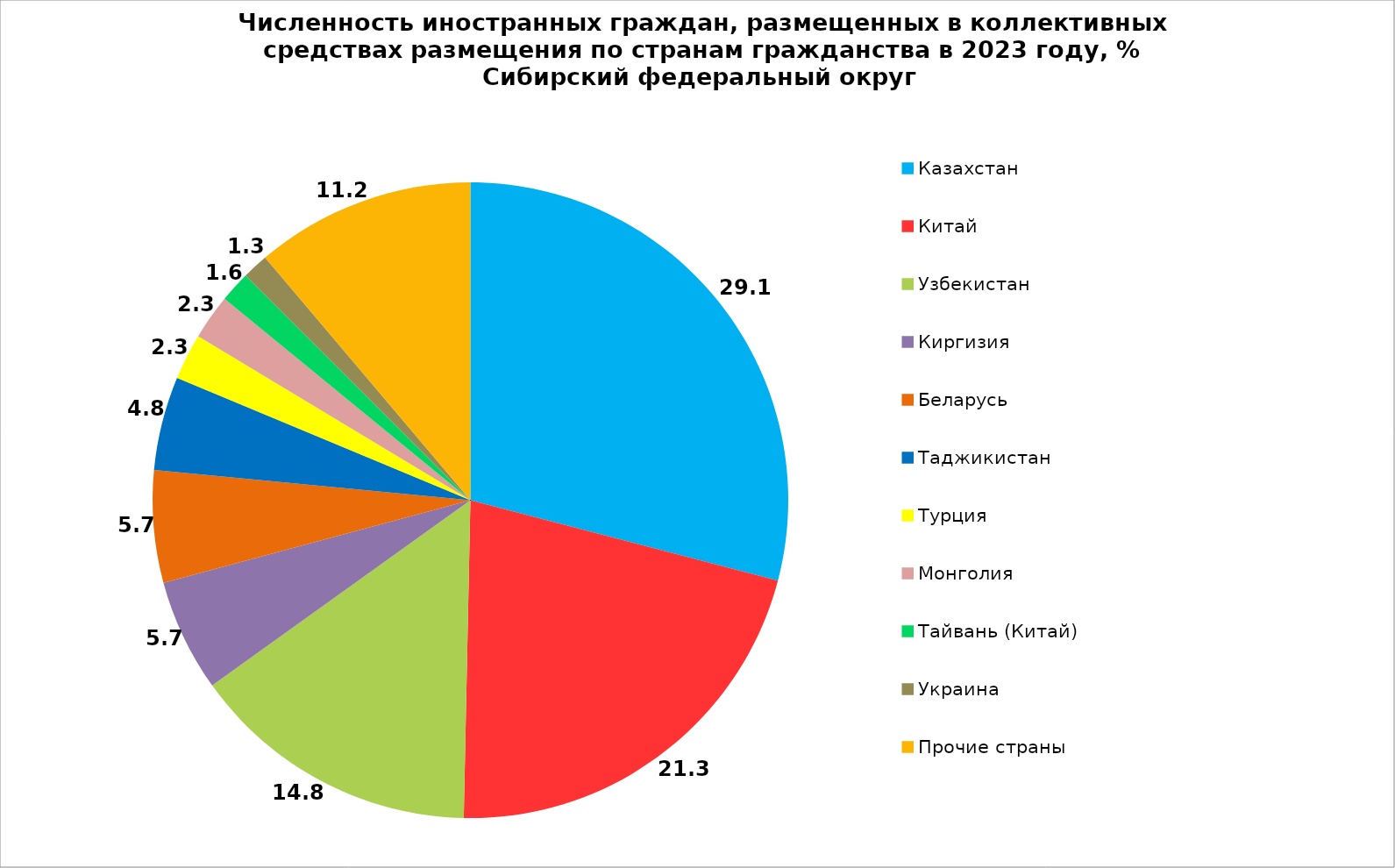
| Category | Series 0 |
|---|---|
| Казахстан | 29.075 |
| Китай | 21.259 |
| Узбекистан | 14.759 |
| Киргизия | 5.726 |
| Беларусь | 5.7 |
| Таджикистан | 4.767 |
| Турция | 2.346 |
| Монголия | 2.289 |
| Тайвань (Китай) | 1.576 |
| Украина | 1.325 |
| Прочие страны | 11.178 |